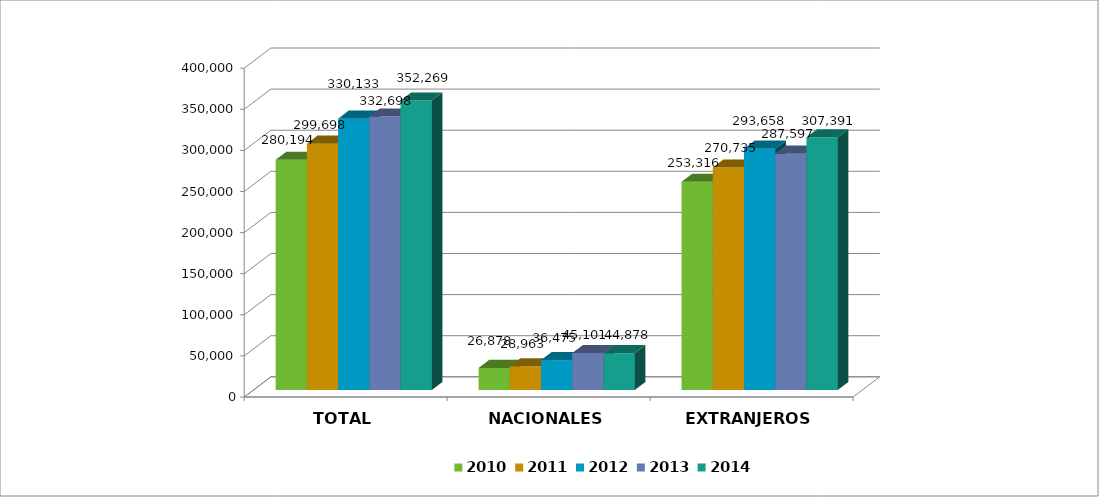
| Category | 2010 | 2011 | 2012 | 2013 | 2014 |
|---|---|---|---|---|---|
| TOTAL | 280194 | 299698 | 330133 | 332698 | 352269 |
| NACIONALES | 26878 | 28963 | 36475 | 45101 | 44878 |
| EXTRANJEROS | 253316 | 270735 | 293658 | 287597 | 307391 |